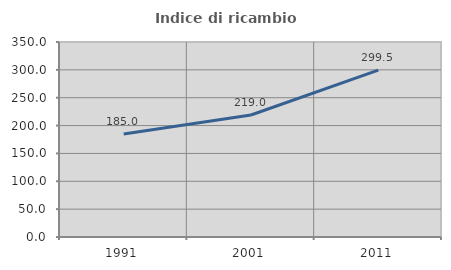
| Category | Indice di ricambio occupazionale  |
|---|---|
| 1991.0 | 185.026 |
| 2001.0 | 219.027 |
| 2011.0 | 299.536 |